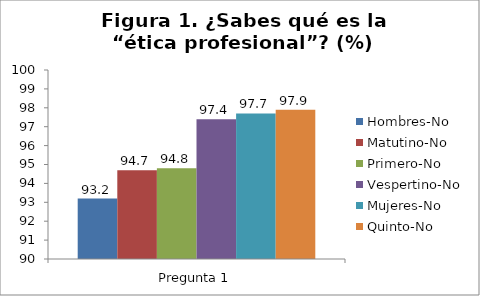
| Category | Hombres-No | Matutino-No | Primero-No | Vespertino-No | Mujeres-No | Quinto-No |
|---|---|---|---|---|---|---|
| 0 | 93.2 | 94.7 | 94.8 | 97.4 | 97.7 | 97.9 |